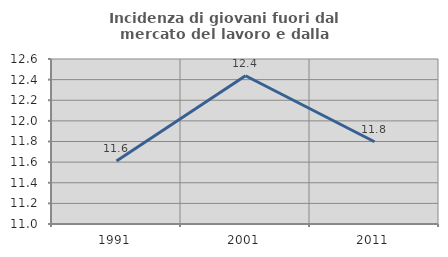
| Category | Incidenza di giovani fuori dal mercato del lavoro e dalla formazione  |
|---|---|
| 1991.0 | 11.61 |
| 2001.0 | 12.438 |
| 2011.0 | 11.798 |